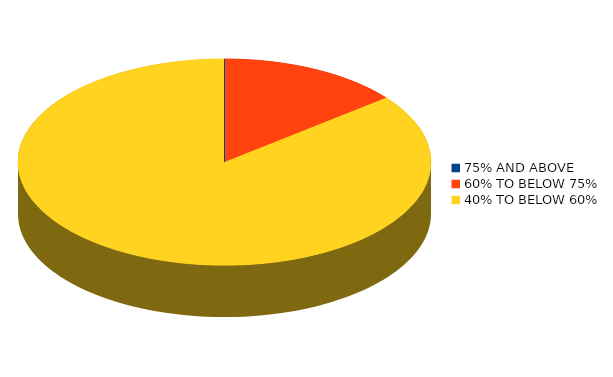
| Category | Number of students |
|---|---|
| 75% AND ABOVE | 0 |
| 60% TO BELOW 75% | 1 |
| 40% TO BELOW 60% | 6 |